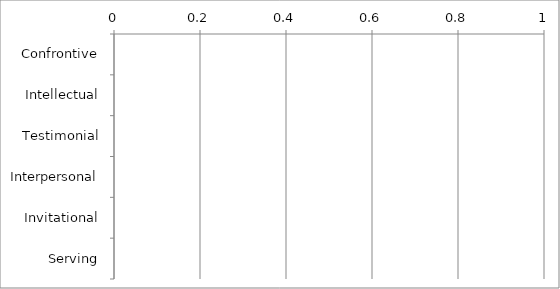
| Category | Series 0 |
|---|---|
| Confrontive | 0 |
| Intellectual | 0 |
| Testimonial | 0 |
| Interpersonal | 0 |
| Invitational | 0 |
| Serving | 0 |